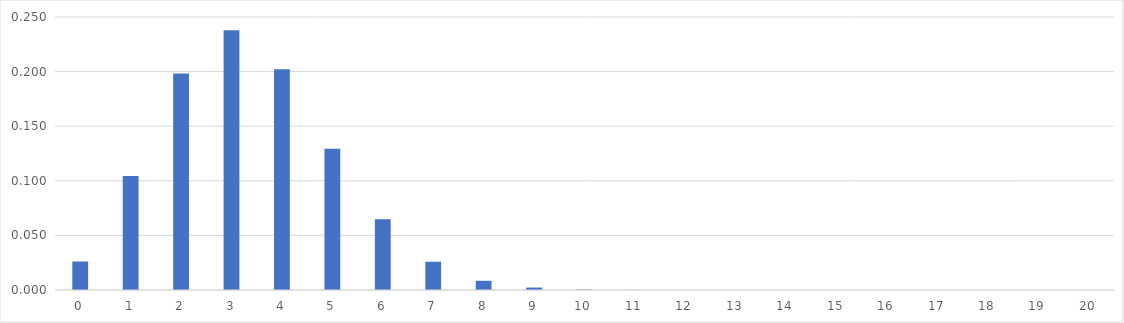
| Category | Series 0 |
|---|---|
| 0.0 | 0.026 |
| 1.0 | 0.104 |
| 2.0 | 0.198 |
| 3.0 | 0.238 |
| 4.0 | 0.202 |
| 5.0 | 0.129 |
| 6.0 | 0.065 |
| 7.0 | 0.026 |
| 8.0 | 0.008 |
| 9.0 | 0.002 |
| 10.0 | 0 |
| 11.0 | 0 |
| 12.0 | 0 |
| 13.0 | 0 |
| 14.0 | 0 |
| 15.0 | 0 |
| 16.0 | 0 |
| 17.0 | 0 |
| 18.0 | 0 |
| 19.0 | 0 |
| 20.0 | 0 |